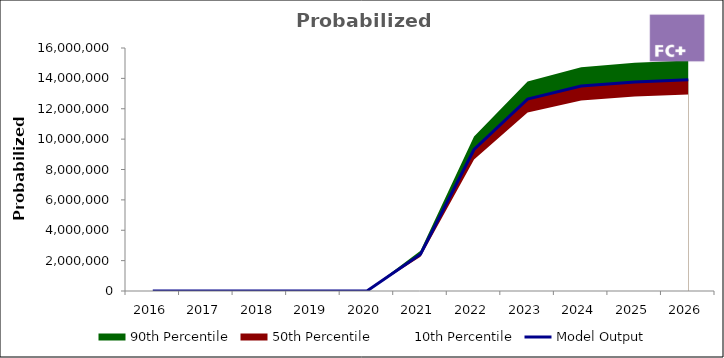
| Category | Model Output |
|---|---|
| 2016 | 0 |
| 2017 | 0 |
| 2018 | 0 |
| 2019 | 0 |
| 2020 | 0 |
| 2021 | 2425739.93 |
| 2022 | 9314942.389 |
| 2023 | 12634948.127 |
| 2024 | 13492503.705 |
| 2025 | 13765097.253 |
| 2026 | 13902748.226 |